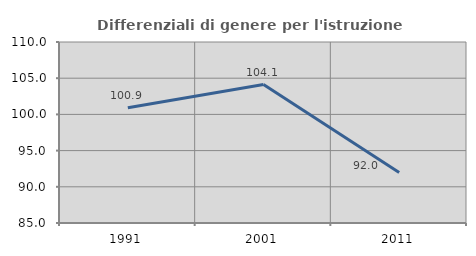
| Category | Differenziali di genere per l'istruzione superiore |
|---|---|
| 1991.0 | 100.912 |
| 2001.0 | 104.119 |
| 2011.0 | 91.981 |